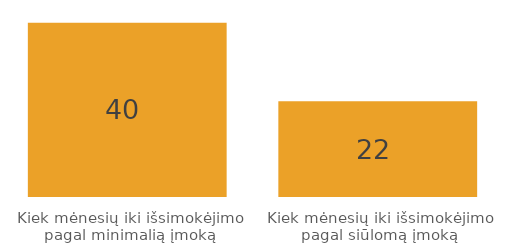
| Category | Series 0 |
|---|---|
| Kiek mėnesių iki išsimokėjimo pagal minimalią įmoką | 40 |
| Kiek mėnesių iki išsimokėjimo pagal siūlomą įmoką | 22 |